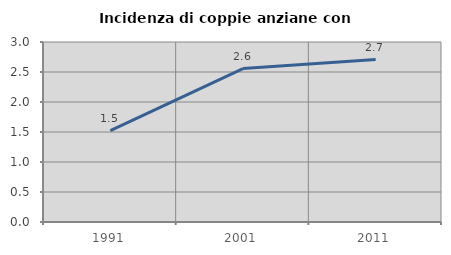
| Category | Incidenza di coppie anziane con figli |
|---|---|
| 1991.0 | 1.521 |
| 2001.0 | 2.558 |
| 2011.0 | 2.707 |